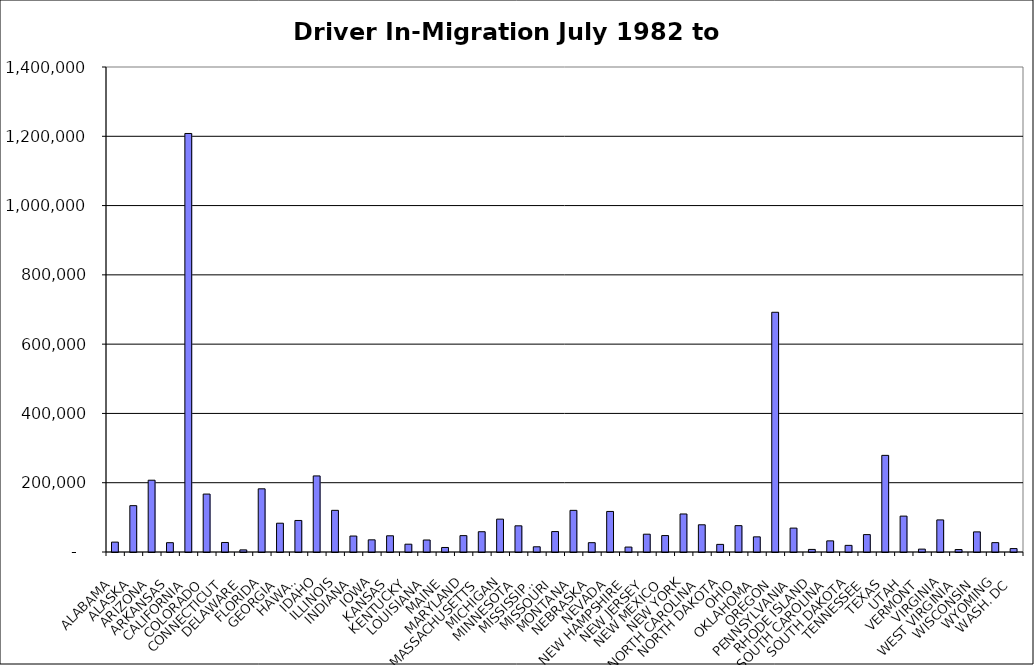
| Category | Series 0 |
|---|---|
| ALABAMA | 28530.5 |
| ALASKA | 133757.5 |
| ARIZONA | 207242 |
| ARKANSAS | 26913.5 |
| CALIFORNIA | 1208115.5 |
| COLORADO | 167210 |
| CONNECTICUT | 27504 |
| DELAWARE | 6095.5 |
| FLORIDA | 182393 |
| GEORGIA | 83094 |
| HAWAII | 91062.5 |
| IDAHO | 219601.5 |
| ILLINOIS | 120277.5 |
| INDIANA | 46080 |
| IOWA | 35121.5 |
| KANSAS | 46805.5 |
| KENTUCKY | 22526 |
| LOUISIANA | 34638.5 |
| MAINE | 13049.5 |
| MARYLAND | 47249 |
| MASSACHUSETTS | 58513 |
| MICHIGAN | 94858 |
| MINNESOTA | 75561.5 |
| MISSISSIPPI | 15056 |
| MISSOURI | 58951 |
| MONTANA | 120210 |
| NEBRASKA | 26912.5 |
| NEVADA | 117063 |
| NEW HAMPSHIRE | 14210.5 |
| NEW JERSEY | 51385 |
| NEW MEXICO | 47437 |
| NEW YORK | 109773 |
| NORTH CAROLINA | 78542.5 |
| NORTH DAKOTA | 21986.5 |
| OHIO | 76057.5 |
| OKLAHOMA | 43749 |
| OREGON | 691990 |
| PENNSYLVANIA | 68989.5 |
| RHODE ISLAND | 7478 |
| SOUTH CAROLINA | 32127.5 |
| SOUTH DAKOTA | 19130.5 |
| TENNESSEE | 50228.5 |
| TEXAS | 278931 |
| UTAH | 103576.5 |
| VERMONT | 8336 |
| VIRGINIA | 92614 |
| WEST VIRGINIA | 7046.5 |
| WISCONSIN | 58083.5 |
| WYOMING | 27040 |
| WASH. DC | 9867 |